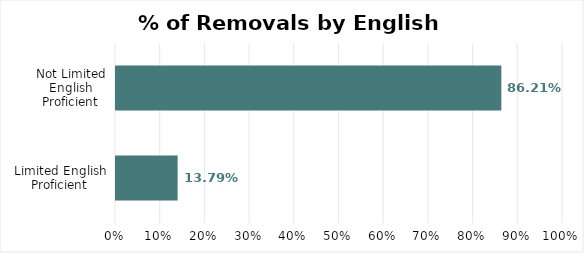
| Category | % of Total Removals |
|---|---|
| Limited English Proficient | 0.138 |
| Not Limited English Proficient | 0.862 |